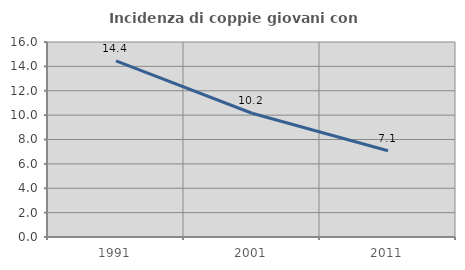
| Category | Incidenza di coppie giovani con figli |
|---|---|
| 1991.0 | 14.446 |
| 2001.0 | 10.153 |
| 2011.0 | 7.074 |